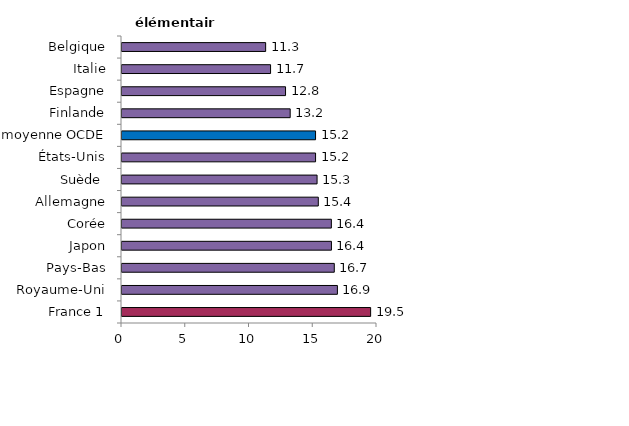
| Category | enseignement élémentaire |
|---|---|
| France 1 | 19.5 |
| Royaume-Uni | 16.895 |
| Pays-Bas | 16.65 |
| Japon | 16.427 |
| Corée | 16.421 |
| Allemagne | 15.396 |
| Suède  | 15.299 |
| États-Unis | 15.182 |
| moyenne OCDE | 15.181 |
| Finlande | 13.192 |
| Espagne | 12.827 |
| Italie | 11.653 |
| Belgique | 11.267 |